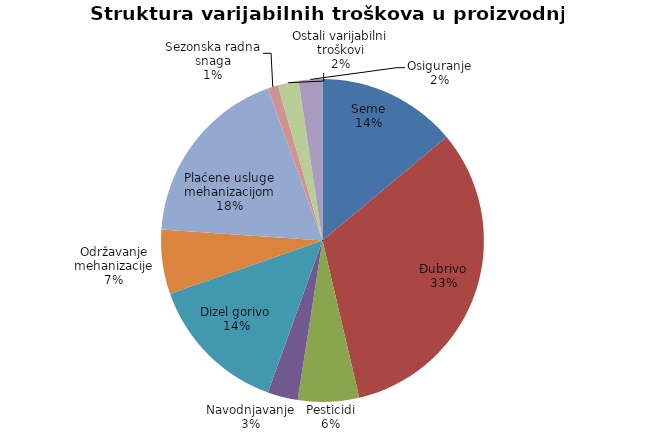
| Category | Series 0 |
|---|---|
| Seme | 10000 |
| Đubrivo | 23250 |
| Pesticidi | 4390 |
| Navodnjavanje | 2175 |
| Dizel gorivo | 10150 |
| Održavanje mehanizacije | 4631.667 |
| Plaćene usluge mehanizacijom | 13200 |
| Sezonska radna snaga | 750 |
| Ostali varijabilni troškovi | 1500 |
| Osiguranje | 1700 |